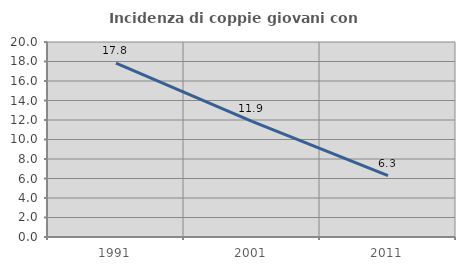
| Category | Incidenza di coppie giovani con figli |
|---|---|
| 1991.0 | 17.84 |
| 2001.0 | 11.863 |
| 2011.0 | 6.291 |